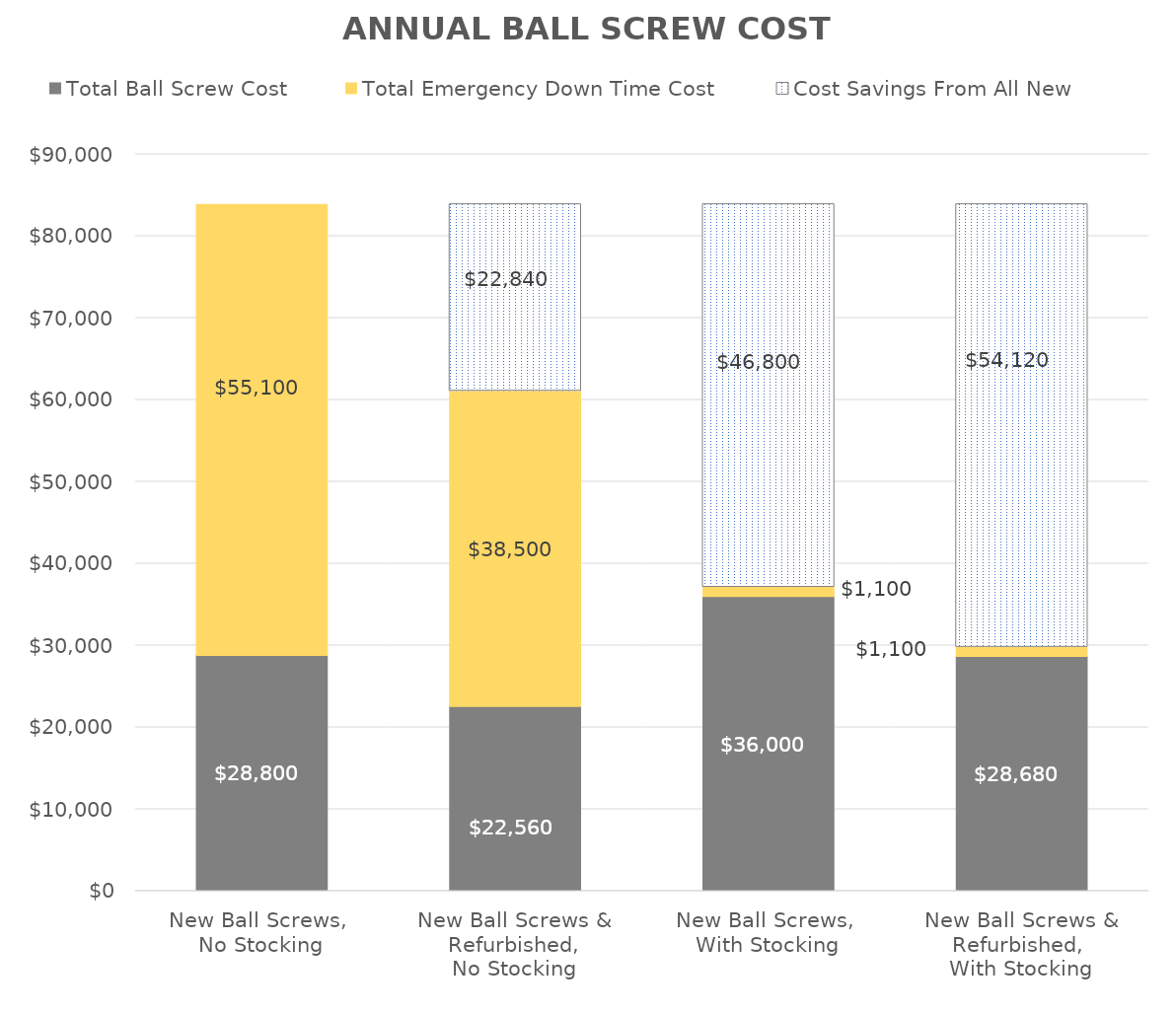
| Category | Total Ball Screw Cost | Total Emergency Down Time Cost | Cost Savings From All New |
|---|---|---|---|
| New Ball Screws, 
No Stocking | 28800 | 55100 | 0 |
| New Ball Screws & Refurbished,
No Stocking | 22560 | 38500 | 22840 |
| New Ball Screws, 
With Stocking | 36000 | 1100 | 46800 |
| New Ball Screws & Refurbished, 
With Stocking | 28680 | 1100 | 54120 |